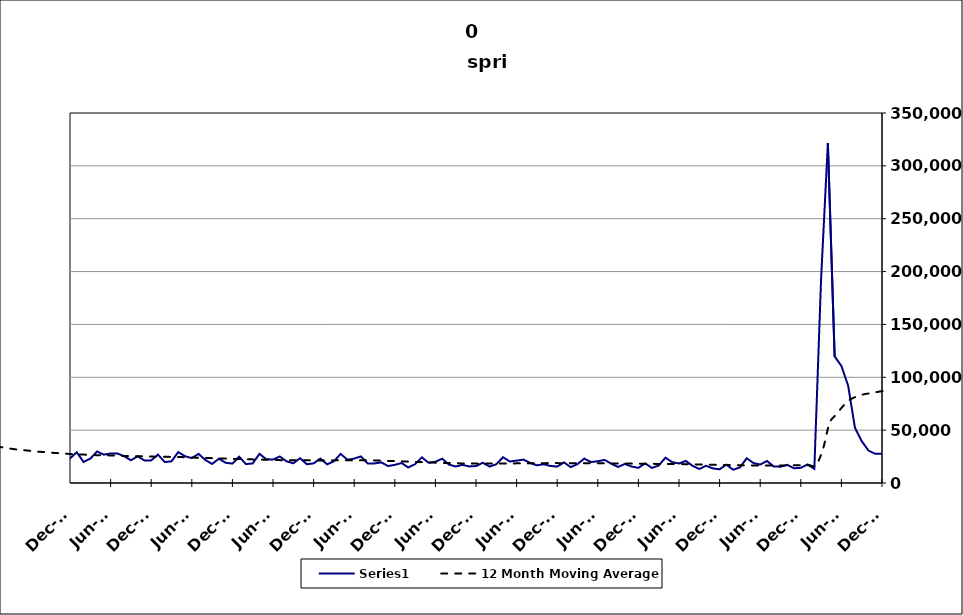
| Category | Series 0 |
|---|---|
| 2005-06-30 | 15559 |
| 2005-07-31 | 18863 |
| 2005-08-31 | 13688 |
| 2005-09-30 | 11216 |
| 2005-10-31 | 15195 |
| 2005-11-30 | 11106 |
| 2005-12-31 | 12178 |
| 2006-01-31 | 12307 |
| 2006-02-28 | 9756 |
| 2006-03-31 | 11166 |
| 2006-04-30 | 18194 |
| 2006-05-31 | 13863 |
| 2006-06-30 | 14337 |
| 2006-07-31 | 17845 |
| 2006-08-31 | 13259 |
| 2006-09-30 | 13170 |
| 2006-10-31 | 14318 |
| 2006-11-30 | 12528 |
| 2006-12-31 | 14662 |
| 2007-01-31 | 14365 |
| 2007-02-28 | 12004 |
| 2007-03-31 | 15715 |
| 2007-04-30 | 21487 |
| 2007-05-31 | 15927 |
| 2007-06-30 | 20117 |
| 2007-07-30 | 19634 |
| 2007-08-31 | 15908 |
| 2007-09-30 | 17289 |
| 2007-10-31 | 17016 |
| 2007-11-15 | 14868 |
| 2007-12-15 09:36:00 | 15051 |
| 2008-01-14 19:12:00 | 19519 |
| 2008-02-14 04:48:00 | 17071 |
| 2008-03-15 14:24:00 | 18041 |
| 2008-04-15 | 26337 |
| 2008-05-15 09:36:00 | 21529 |
| 2008-06-14 19:12:00 | 24509 |
| 2008-07-15 04:48:00 | 26739 |
| 2008-08-14 14:24:00 | 22508 |
| 2008-09-14 | 24197 |
| 2008-10-14 09:36:00 | 30666 |
| 2008-11-13 19:12:00 | 30363 |
| 2008-12-14 04:48:00 | 34409 |
| 2009-01-13 14:24:00 | 39076 |
| 2009-02-13 | 34958 |
| 2009-03-15 09:36:00 | 39174 |
| 2009-04-14 19:12:00 | 41068 |
| 2009-05-15 04:48:00 | 34839 |
| 2009-06-14 14:24:00 | 38758 |
| 2009-07-15 | 38827 |
| 2009-08-14 09:36:00 | 32747 |
| 2009-09-13 19:12:00 | 30654 |
| 2009-10-14 04:48:00 | 31279 |
| 2009-11-13 14:24:00 | 28764 |
| 2009-12-14 | 28567 |
| 2010-01-13 09:36:00 | 31536 |
| 2010-02-12 19:12:00 | 23411 |
| 2010-03-15 04:48:00 | 27064 |
| 2010-04-14 14:24:00 | 31806 |
| 2010-05-15 | 27535 |
| 2010-06-14 09:36:00 | 30999 |
| 2010-07-14 19:12:00 | 30859 |
| 2010-08-14 04:48:00 | 27473 |
| 2010-09-13 14:24:00 | 23569 |
| 2010-10-14 | 26397 |
| 2010-11-13 09:36:00 | 23332 |
| 2010-12-13 19:12:00 | 23208 |
| 2011-01-13 04:48:00 | 29123 |
| 2011-02-12 14:24:00 | 19880 |
| 2011-03-15 | 23037 |
| 2011-04-14 09:36:00 | 29838 |
| 2011-05-14 19:12:00 | 26805 |
| 2011-06-14 04:48:00 | 27951 |
| 2011-07-14 14:24:00 | 27959 |
| 2011-08-14 | 25368 |
| 2011-09-13 09:36:00 | 21516 |
| 2011-10-13 19:12:00 | 25249 |
| 2011-11-13 04:48:00 | 21348 |
| 2011-12-13 14:24:00 | 21373 |
| 2012-01-13 | 26870 |
| 2012-02-12 09:36:00 | 19799 |
| 2012-03-13 19:12:00 | 20523 |
| 2012-04-13 04:48:00 | 29208 |
| 2012-05-13 14:24:00 | 25322 |
| 2012-06-13 | 23562 |
| 2012-07-13 09:36:00 | 27564 |
| 2012-08-12 19:12:00 | 21787 |
| 2012-09-12 04:48:00 | 18024 |
| 2012-10-12 14:24:00 | 22967 |
| 2012-11-12 | 19147 |
| 2012-12-12 09:36:00 | 18332 |
| 2013-01-11 19:12:00 | 24929 |
| 2013-02-11 04:48:00 | 17864 |
| 2013-03-13 14:24:00 | 18518 |
| 2013-04-13 | 27564 |
| 2013-05-13 09:36:00 | 22544 |
| 2013-06-12 19:12:00 | 22178 |
| 2013-07-13 04:48:00 | 25052 |
| 2013-08-12 14:24:00 | 20510 |
| 2013-09-12 | 18652 |
| 2013-10-12 09:36:00 | 23457 |
| 2013-11-11 19:12:00 | 17762 |
| 2013-12-12 04:48:00 | 18554 |
| 2014-01-11 14:24:00 | 23110 |
| 2014-02-11 | 17656 |
| 2014-03-13 09:36:00 | 20574 |
| 2014-04-12 19:12:00 | 27528 |
| 2014-05-13 04:48:00 | 22003 |
| 2014-06-12 14:24:00 | 23093 |
| 2014-07-13 | 25159 |
| 2014-08-12 09:36:00 | 18501 |
| 2014-09-11 19:12:00 | 18519 |
| 2014-10-12 04:48:00 | 19501 |
| 2014-11-11 14:24:00 | 16036 |
| 2014-12-12 | 17142 |
| 2015-01-11 09:36:00 | 18920 |
| 2015-02-10 19:12:00 | 14673 |
| 2015-03-13 04:48:00 | 17842 |
| 2015-04-12 14:24:00 | 24284 |
| 2015-05-13 | 19120 |
| 2015-06-12 09:36:00 | 20073 |
| 2015-07-12 19:12:00 | 23007 |
| 2015-08-12 04:48:00 | 17420 |
| 2015-09-11 14:24:00 | 15620 |
| 2015-10-12 | 17117 |
| 2015-11-11 09:36:00 | 15685 |
| 2015-12-11 19:12:00 | 16020 |
| 2016-01-11 04:48:00 | 19143 |
| 2016-02-10 14:24:00 | 15551 |
| 2016-03-12 | 17721 |
| 2016-04-11 09:36:00 | 24381 |
| 2016-05-11 19:12:00 | 20319 |
| 2016-06-11 04:48:00 | 21157 |
| 2016-07-11 14:24:00 | 22155 |
| 2016-08-11 | 18945 |
| 2016-09-10 09:36:00 | 16699 |
| 2016-10-10 19:12:00 | 17773 |
| 2016-11-10 04:48:00 | 16104 |
| 2016-12-10 14:24:00 | 15555 |
| 2017-01-10 | 19468 |
| 2017-02-09 09:36:00 | 15031 |
| 2017-03-11 19:12:00 | 17840 |
| 2017-04-11 04:48:00 | 23124 |
| 2017-05-11 14:24:00 | 19802 |
| 2017-06-11 | 20588 |
| 2017-07-11 09:36:00 | 21858 |
| 2017-08-10 19:12:00 | 18231 |
| 2017-09-10 04:48:00 | 15171 |
| 2017-10-10 14:24:00 | 18027 |
| 2017-11-10 | 15538 |
| 2017-12-10 09:36:00 | 14339 |
| 2018-01-09 19:12:00 | 18538 |
| 2018-02-09 04:48:00 | 14230 |
| 2018-03-11 14:24:00 | 16525 |
| 2018-04-11 | 23962 |
| 2018-05-11 09:36:00 | 19679 |
| 2018-06-10 19:12:00 | 18492 |
| 2018-07-11 04:48:00 | 20879 |
| 2018-08-10 14:24:00 | 16306 |
| 2018-09-10 | 13227 |
| 2018-10-10 09:36:00 | 16273 |
| 2018-11-09 19:12:00 | 13796 |
| 2018-12-10 04:48:00 | 12964 |
| 2019-01-09 14:24:00 | 17391 |
| 2019-02-09 | 12534 |
| 2019-03-11 09:36:00 | 14705 |
| 2019-04-10 19:12:00 | 23399 |
| 2019-05-11 04:48:00 | 18895 |
| 2019-06-10 14:24:00 | 17486 |
| 2019-07-11 | 20792 |
| 2019-08-10 09:36:00 | 15676 |
| 2019-09-09 19:12:00 | 15415 |
| 2019-10-10 04:48:00 | 17202 |
| 2019-11-09 14:24:00 | 13905 |
| 2019-12-10 | 14356 |
| 2020-01-09 09:36:00 | 17551 |
| 2020-02-08 19:12:00 | 13374 |
| 2020-03-10 04:48:00 | 193236 |
| 2020-04-09 14:24:00 | 321397 |
| 2020-05-10 | 119809 |
| 2020-06-09 09:36:00 | 110709 |
| 2020-07-09 19:12:00 | 91992 |
| 2020-08-09 04:48:00 | 52303 |
| 2020-09-08 14:24:00 | 39616 |
| 2020-10-09 | 30687 |
| 2020-11-08 09:36:00 | 27606 |
| 2020-12-08 19:12:00 | 27606 |